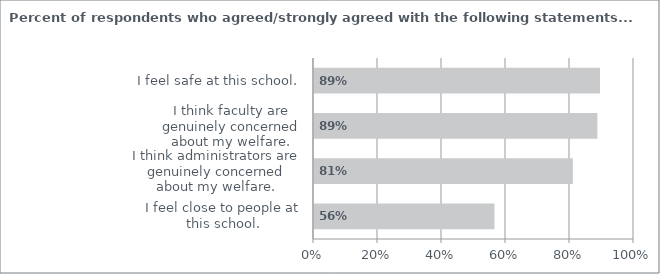
| Category | Strongly Agree/Agree |
|---|---|
| I feel close to people at this school. | 0.564 |
| I think administrators are genuinely concerned about my welfare. | 0.809 |
| I think faculty are genuinely concerned about my welfare. | 0.886 |
| I feel safe at this school. | 0.894 |